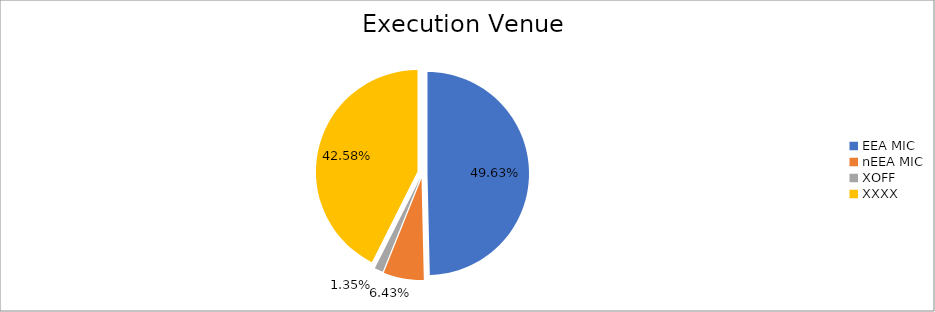
| Category | Series 0 |
|---|---|
| EEA MIC | 3556659.629 |
| nEEA MIC | 460873.951 |
| XOFF | 97018.673 |
| XXXX | 3051303.346 |